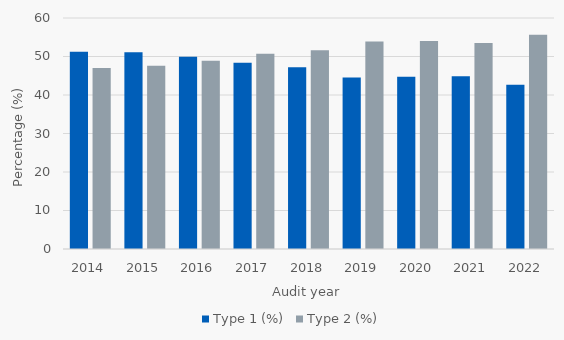
| Category | Type 1 (%) | Type 2 (%) |
|---|---|---|
| 2014.0 | 51.252 | 47.013 |
| 2015.0 | 51.129 | 47.581 |
| 2016.0 | 49.928 | 48.921 |
| 2017.0 | 48.383 | 50.712 |
| 2018.0 | 47.186 | 51.623 |
| 2019.0 | 44.559 | 53.901 |
| 2020.0 | 44.715 | 54.017 |
| 2021.0 | 44.877 | 53.484 |
| 2022.0 | 42.657 | 55.659 |